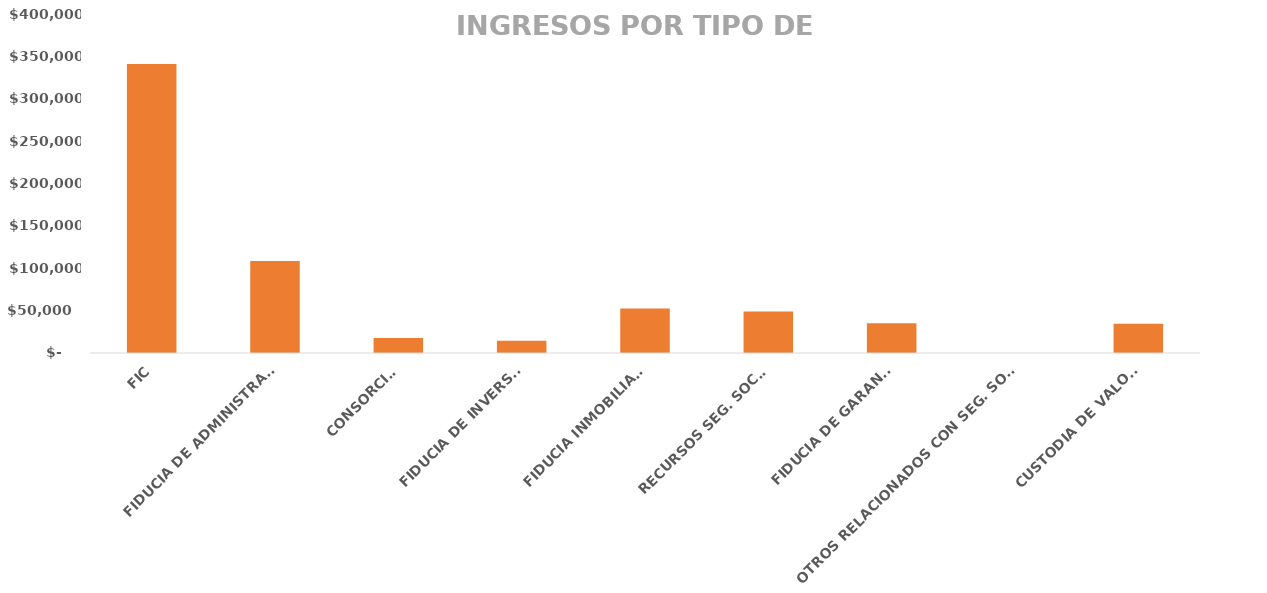
| Category | Series 0 |
|---|---|
| FIC | 341104 |
| FIDUCIA DE ADMINISTRACIÓN | 108490 |
| CONSORCIOS | 17798 |
| FIDUCIA DE INVERSION | 14343 |
| FIDUCIA INMOBILIARIA | 52639 |
| RECURSOS SEG. SOCIAL | 49075 |
| FIDUCIA DE GARANTIA | 34958 |
| OTROS RELACIONADOS CON SEG. SOCIAL  | 121 |
| CUSTODIA DE VALORES | 34563 |